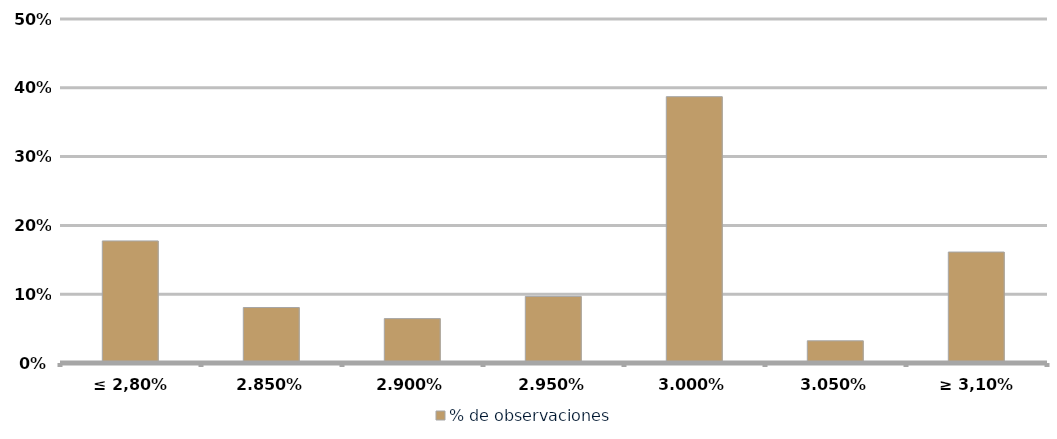
| Category | % de observaciones  |
|---|---|
| ≤ 2,80% | 0.177 |
| 2,85% | 0.081 |
| 2,90% | 0.065 |
| 2,95% | 0.097 |
| 3,00% | 0.387 |
| 3,05% | 0.032 |
| ≥ 3,10% | 0.161 |